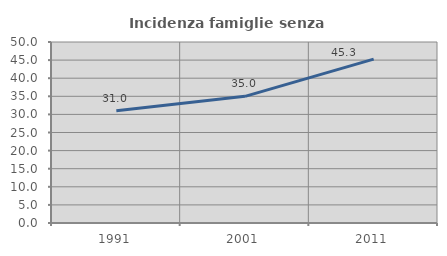
| Category | Incidenza famiglie senza nuclei |
|---|---|
| 1991.0 | 31.024 |
| 2001.0 | 34.985 |
| 2011.0 | 45.283 |